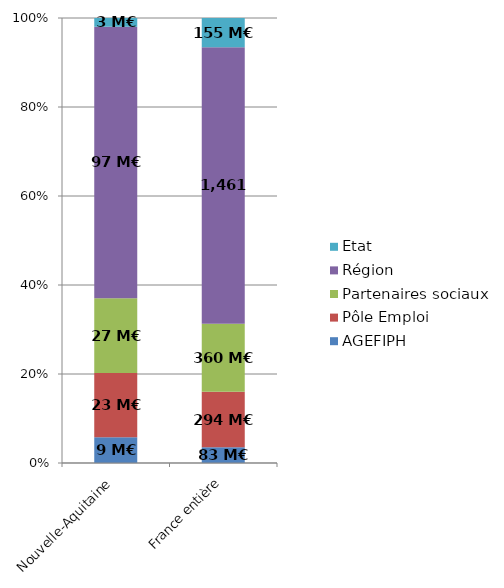
| Category | AGEFIPH | Pôle Emploi | Partenaires sociaux | Région | Etat |
|---|---|---|---|---|---|
| Nouvelle-Aquitaine | 9.25 | 22.966 | 26.721 | 97.056 | 3.113 |
| France entière | 82.716 | 293.959 | 359.593 | 1461.057 | 154.74 |